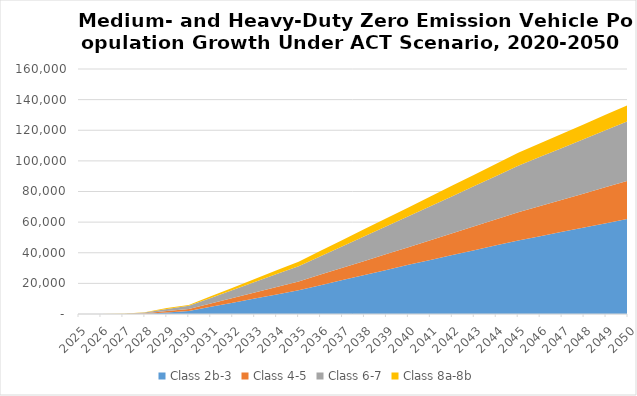
| Category | Class 2b-3 | Class 4-5 | Class 6-7 | Class 8a-8b |
|---|---|---|---|---|
| 2025.0 | 0 | 0 | 0 | 0 |
| 2026.0 | 0 | 0 | 0 | 0 |
| 2027.0 | 0 | 30.014 | 47.575 | 15.703 |
| 2028.0 | 231.58 | 282.622 | 478.422 | 157.271 |
| 2029.0 | 1022.282 | 856.305 | 1462.42 | 626.922 |
| 2030.0 | 1990 | 1230 | 2120 | 530 |
| 2031.0 | 4692 | 2130 | 3698 | 1012 |
| 2032.0 | 7394 | 3030 | 5276 | 1494 |
| 2033.0 | 10096 | 3930 | 6854 | 1976 |
| 2034.0 | 12798 | 4830 | 8432 | 2458 |
| 2035.0 | 15500 | 5730 | 10010 | 2940 |
| 2036.0 | 18826 | 6890 | 12028 | 3520 |
| 2037.0 | 22152 | 8050 | 14046 | 4100 |
| 2038.0 | 25478 | 9210 | 16064 | 4680 |
| 2039.0 | 28804 | 10370 | 18082 | 5260 |
| 2040.0 | 32130 | 11530 | 20100 | 5840 |
| 2041.0 | 35304 | 12898 | 22162 | 6362 |
| 2042.0 | 38478 | 14266 | 24224 | 6884 |
| 2043.0 | 41652 | 15634 | 26286 | 7406 |
| 2044.0 | 44826 | 17002 | 28348 | 7928 |
| 2045.0 | 48000 | 18370 | 30410 | 8450 |
| 2046.0 | 50822 | 19676 | 32132 | 8854 |
| 2047.0 | 53644 | 20982 | 33854 | 9258 |
| 2048.0 | 56466 | 22288 | 35576 | 9662 |
| 2049.0 | 59288 | 23594 | 37298 | 10066 |
| 2050.0 | 62110 | 24900 | 39020 | 10470 |